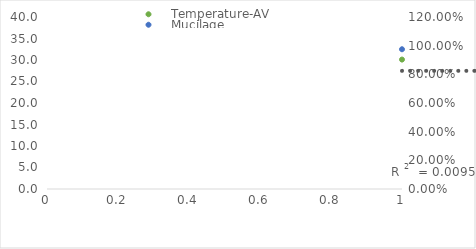
| Category | Temperature-AV |
|---|---|
| 0 | 30.1 |
| 1 | 23.85 |
| 2 | 32.1 |
| 3 | 25.5 |
| 4 | 24.95 |
| 5 | 30.85 |
| 6 | 30.1 |
| 7 | 24.35 |
| 8 | 24.65 |
| 9 | 28.55 |
| 10 | 18.4 |
| 11 | 24.2 |
| 12 | 28.9 |
| 13 | 30.05 |
| 14 | 27.05 |
| 15 | 24.75 |
| 16 | 27.05 |
| 17 | 25.75 |
| 18 | 24.95 |
| 19 | 32.95 |
| 20 | 30.4 |
| 21 | 25.55 |
| 22 | 24.9 |
| 23 | 25.15 |
| 24 | 27.95 |
| 25 | 28.3 |
| 26 | 27.2 |
| 27 | 24.7 |
| 28 | 32.15 |
| 29 | 32.2 |
| 30 | 23.1 |
| 31 | 26.3 |
| 32 | 29.4 |
| 33 | 30.2 |
| 34 | 28.65 |
| 35 | 24.1 |
| 36 | 30.8 |
| 37 | 27.35 |
| 38 | 31.65 |
| 39 | 27.75 |
| 40 | 31.25 |
| 41 | 24.85 |
| 42 | 31.25 |
| 43 | 31.6 |
| 44 | 30.45 |
| 45 | 26.3 |
| 46 | 27.95 |
| 47 | 30.5 |
| 48 | 28.3 |
| 49 | 27.95 |
| 50 | 30.25 |
| 51 | 30.1 |
| 52 | 31.1 |
| 53 | 32.3 |
| 54 | 26.05 |
| 55 | 29.7 |
| 56 | 33.35 |
| 57 | 27.25 |
| 58 | 31.15 |
| 59 | 32.65 |
| 60 | 29.8 |
| 61 | 32.25 |
| 62 | 26.55 |
| 63 | 27.8 |
| 64 | 30.95 |
| 65 | 30.8 |
| 66 | 29 |
| 67 | 30.55 |
| 68 | 31.95 |
| 69 | 29.35 |
| 70 | 26.1 |
| 71 | 31.7 |
| 72 | 22.1 |
| 73 | 30.75 |
| 74 | 31.1 |
| 75 | 24.4 |
| 76 | 14.75 |
| 77 | 30.5 |
| 78 | 30.6 |
| 79 | 31.85 |
| 80 | 31.65 |
| 81 | 25.65 |
| 82 | 25.85 |
| 83 | 30.2 |
| 84 | 30.6 |
| 85 | 21.5 |
| 86 | 19.65 |
| 87 | 31.4 |
| 88 | 24 |
| 89 | 33.7 |
| 90 | 31.15 |
| 91 | 32.1 |
| 92 | 30.8 |
| 93 | 27.3 |
| 94 | 17.8 |
| 95 | 30.5 |
| 96 | 33.45 |
| 97 | 10 |
| 98 | 30.35 |
| 99 | 23.15 |
| 100 | 31 |
| 101 | 26.05 |
| 102 | 23.15 |
| 103 | 25.65 |
| 104 | 32.35 |
| 105 | 33.3 |
| 106 | 23.3 |
| 107 | 19.6 |
| 108 | 34.05 |
| 109 | 32.35 |
| 110 | 25.95 |
| 111 | 30 |
| 112 | 22.35 |
| 113 | 29.35 |
| 114 | 33.2 |
| 115 | 23.85 |
| 116 | 33.9 |
| 117 | 33.85 |
| 118 | 32.15 |
| 119 | 27.35 |
| 120 | 31.4 |
| 121 | 33.55 |
| 122 | 34.2 |
| 123 | 30.95 |
| 124 | 30.55 |
| 125 | 21.1 |
| 126 | 35.4 |
| 127 | 27.4 |
| 128 | 24.35 |
| 129 | 30.55 |
| 130 | 24.25 |
| 131 | 31.15 |
| 132 | 32.75 |
| 133 | 34.8 |
| 134 | 32.7 |
| 135 | 31.8 |
| 136 | 28.2 |
| 137 | 23.65 |
| 138 | 16.95 |
| 139 | 13.05 |
| 140 | 30.45 |
| 141 | 24.75 |
| 142 | 31.45 |
| 143 | 35 |
| 144 | 33.9 |
| 145 | 32.95 |
| 146 | 32.95 |
| 147 | 32.4 |
| 148 | 33.8 |
| 149 | 33.5 |
| 150 | 28.4 |
| 151 | 31.45 |
| 152 | 32.65 |
| 153 | 34.1 |
| 154 | 33.35 |
| 155 | 32.95 |
| 156 | 32.1 |
| 157 | 30.2 |
| 158 | 31.75 |
| 159 | 32.65 |
| 160 | 31 |
| 161 | 31 |
| 162 | 30.85 |
| 163 | 30.7 |
| 164 | 30.85 |
| 165 | 31.25 |
| 166 | 31.55 |
| 167 | 27.25 |
| 168 | 27.65 |
| 169 | 29.25 |
| 170 | 29.15 |
| 171 | 30.5 |
| 172 | 31.45 |
| 173 | 29.95 |
| 174 | 31.05 |
| 175 | 26.45 |
| 176 | 27.85 |
| 177 | 28.45 |
| 178 | 27.8 |
| 179 | 28.95 |
| 180 | 28.1 |
| 181 | 28 |
| 182 | 27.05 |
| 183 | 28.1 |
| 184 | 28.2 |
| 185 | 27.2 |
| 186 | 27.45 |
| 187 | 26.2 |
| 188 | 28 |
| 189 | 29.05 |
| 190 | 26.2 |
| 191 | 26.75 |
| 192 | 26.9 |
| 193 | 27.85 |
| 194 | 26.85 |
| 195 | 28.5 |
| 196 | 26.5 |
| 197 | 27.2 |
| 198 | 26.75 |
| 199 | 26.9 |
| 200 | 26.45 |
| 201 | 25.65 |
| 202 | 24.55 |
| 203 | 25.8 |
| 204 | 22.55 |
| 205 | 21.15 |
| 206 | 22.5 |
| 207 | 25.95 |
| 208 | 25.5 |
| 209 | 24.85 |
| 210 | 24.7 |
| 211 | 25.25 |
| 212 | 26.5 |
| 213 | 25.05 |
| 214 | 24.8 |
| 215 | 25.8 |
| 216 | 27.6 |
| 217 | 28.15 |
| 218 | 27.95 |
| 219 | 27.7 |
| 220 | 26.8 |
| 221 | 18.2 |
| 222 | 16.75 |
| 223 | 17.05 |
| 224 | 20.25 |
| 225 | 20.15 |
| 226 | 23.15 |
| 227 | 23.9 |
| 228 | 24.1 |
| 229 | 24 |
| 230 | 25.65 |
| 231 | 19.35 |
| 232 | 21.9 |
| 233 | 22.5 |
| 234 | 20.55 |
| 235 | 23.5 |
| 236 | 22.7 |
| 237 | 22.3 |
| 238 | 24.85 |
| 239 | 21.25 |
| 240 | 14.8 |
| 241 | 14.1 |
| 242 | 17.15 |
| 243 | 18.45 |
| 244 | 21.7 |
| 245 | 23.55 |
| 246 | 19.6 |
| 247 | 21.3 |
| 248 | 23.75 |
| 249 | 23.6 |
| 250 | 24.6 |
| 251 | 23.45 |
| 252 | 23.9 |
| 253 | 23.4 |
| 254 | 23.5 |
| 255 | 24 |
| 256 | 24.6 |
| 257 | 26.5 |
| 258 | 25.75 |
| 259 | 25.25 |
| 260 | 27.4 |
| 261 | 28.75 |
| 262 | 28.25 |
| 263 | 28.75 |
| 264 | 28.75 |
| 265 | 27.5 |
| 266 | 21.9 |
| 267 | 25.2 |
| 268 | 27 |
| 269 | 28 |
| 270 | 27.9 |
| 271 | 28 |
| 272 | 28.8 |
| 273 | 28.4 |
| 274 | 26.4 |
| 275 | 21.55 |
| 276 | 26.3 |
| 277 | 27.75 |
| 278 | 29.75 |
| 279 | 30.6 |
| 280 | 31.9 |
| 281 | 30.15 |
| 282 | 29.95 |
| 283 | 29.5 |
| 284 | 30.65 |
| 285 | 28.9 |
| 286 | 26.95 |
| 287 | 29.95 |
| 288 | 31.15 |
| 289 | 29.15 |
| 290 | 25.7 |
| 291 | 28.3 |
| 292 | 30.35 |
| 293 | 29.75 |
| 294 | 29.85 |
| 295 | 30.25 |
| 296 | 31.75 |
| 297 | 30.05 |
| 298 | 31.55 |
| 299 | 33.3 |
| 300 | 31.5 |
| 301 | 31.3 |
| 302 | 31.45 |
| 303 | 31.25 |
| 304 | 32.8 |
| 305 | 27.2 |
| 306 | 31.8 |
| 307 | 33.65 |
| 308 | 30.85 |
| 309 | 30.8 |
| 310 | 34.95 |
| 311 | 32.75 |
| 312 | 33.75 |
| 313 | 35 |
| 314 | 32.35 |
| 315 | 34.45 |
| 316 | 33.7 |
| 317 | 31.1 |
| 318 | 34.5 |
| 319 | 34.95 |
| 320 | 31.65 |
| 321 | 35.65 |
| 322 | 36.55 |
| 323 | 37.1 |
| 324 | 37.2 |
| 325 | 33.75 |
| 326 | 28.85 |
| 327 | 27.5 |
| 328 | 31.65 |
| 329 | 34.05 |
| 330 | 35.25 |
| 331 | 35.45 |
| 332 | 35.6 |
| 333 | 36.25 |
| 334 | 23.15 |
| 335 | 37.1 |
| 336 | 36.8 |
| 337 | 34.3 |
| 338 | 34.55 |
| 339 | 33.3 |
| 340 | 33.25 |
| 341 | 34.45 |